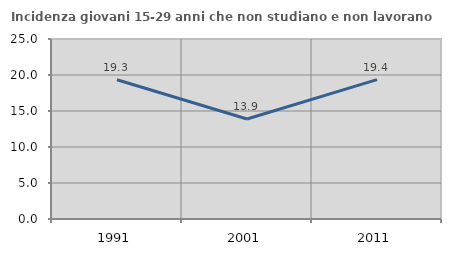
| Category | Incidenza giovani 15-29 anni che non studiano e non lavorano  |
|---|---|
| 1991.0 | 19.344 |
| 2001.0 | 13.881 |
| 2011.0 | 19.365 |